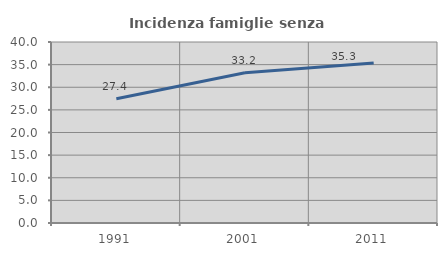
| Category | Incidenza famiglie senza nuclei |
|---|---|
| 1991.0 | 27.442 |
| 2001.0 | 33.216 |
| 2011.0 | 35.337 |